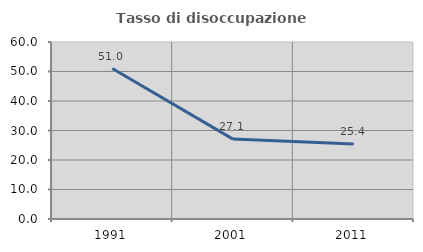
| Category | Tasso di disoccupazione giovanile  |
|---|---|
| 1991.0 | 51.011 |
| 2001.0 | 27.079 |
| 2011.0 | 25.417 |